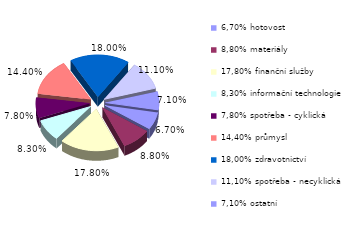
| Category | Series 0 |
|---|---|
| 6,70% hotovost | 0.067 |
| 8,80% materiály | 0.088 |
| 17,80% finanční služby | 0.178 |
| 8,30% informační technologie | 0.083 |
| 7,80% spotřeba - cyklická | 0.078 |
| 14,40% průmysl | 0.144 |
| 18,00% zdravotnictví | 0.18 |
| 11,10% spotřeba - necyklická | 0.111 |
| 7,10% ostatní | 0.071 |